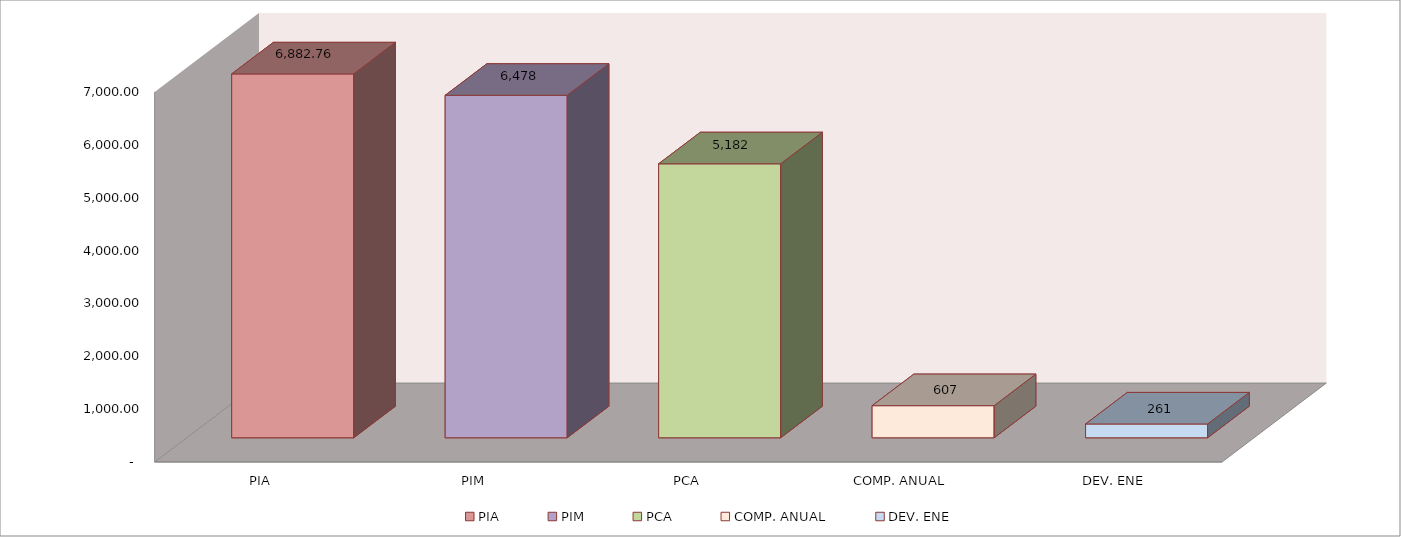
| Category | 011 MINISTERIO DE SALUD |
|---|---|
| PIA | 6882.759 |
| PIM | 6477.956 |
| PCA | 5182.365 |
| COMP. ANUAL | 607.336 |
| DEV. ENE | 260.781 |